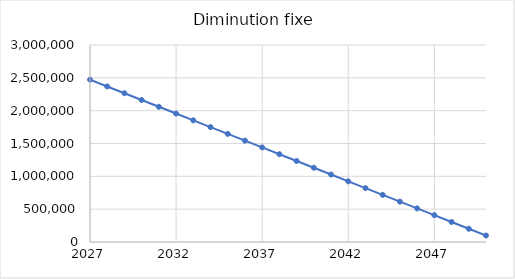
| Category | Diminution fixe |
|---|---|
| 2027.0 | 2471976 |
| 2028.0 | 2368794.435 |
| 2029.0 | 2265612.87 |
| 2030.0 | 2162431.304 |
| 2031.0 | 2059249.739 |
| 2032.0 | 1956068.174 |
| 2033.0 | 1852886.609 |
| 2034.0 | 1749705.043 |
| 2035.0 | 1646523.478 |
| 2036.0 | 1543341.913 |
| 2037.0 | 1440160.348 |
| 2038.0 | 1336978.783 |
| 2039.0 | 1233797.217 |
| 2040.0 | 1130615.652 |
| 2041.0 | 1027434.087 |
| 2042.0 | 924252.522 |
| 2043.0 | 821070.957 |
| 2044.0 | 717889.391 |
| 2045.0 | 614707.826 |
| 2046.0 | 511526.261 |
| 2047.0 | 408344.696 |
| 2048.0 | 305163.13 |
| 2049.0 | 201981.565 |
| 2050.0 | 98800 |